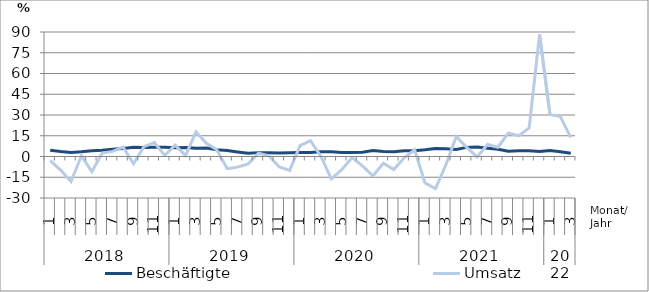
| Category | Beschäftigte | Umsatz |
|---|---|---|
| 0 | 4.5 | -3 |
| 1 | 3.6 | -9.8 |
| 2 | 2.9 | -18.1 |
| 3 | 3.4 | 0.5 |
| 4 | 4.2 | -11 |
| 5 | 4.5 | 2.5 |
| 6 | 5.3 | 3.7 |
| 7 | 5.8 | 6.8 |
| 8 | 6.6 | -5.2 |
| 9 | 6.5 | 7.1 |
| 10 | 6.6 | 10.1 |
| 11 | 6.6 | 0.8 |
| 12 | 6.4 | 8.2 |
| 13 | 6.5 | 0.6 |
| 14 | 6 | 17.8 |
| 15 | 6.1 | 9.6 |
| 16 | 4.9 | 4.9 |
| 17 | 4.3 | -8.8 |
| 18 | 3.3 | -7.7 |
| 19 | 2.4 | -5.4 |
| 20 | 2.8 | 2.4 |
| 21 | 2.7 | 0.5 |
| 22 | 2.5 | -7.6 |
| 23 | 2.7 | -10 |
| 24 | 2.9 | 7.8 |
| 25 | 2.9 | 11.5 |
| 26 | 3.4 | 0.1 |
| 27 | 3.4 | -16.1 |
| 28 | 2.9 | -9.5 |
| 29 | 2.9 | -0.8 |
| 30 | 3.1 | -6.9 |
| 31 | 4.3 | -14 |
| 32 | 3.6 | -4.9 |
| 33 | 3.4 | -9.4 |
| 34 | 4.1 | -0.9 |
| 35 | 4.1 | 4.9 |
| 36 | 4.8 | -19.1 |
| 37 | 5.8 | -23.3 |
| 38 | 5.6 | -6.1 |
| 39 | 5 | 14.4 |
| 40 | 6.6 | 6.6 |
| 41 | 6.9 | -0.3 |
| 42 | 6 | 8.7 |
| 43 | 5.2 | 6.7 |
| 44 | 3.8 | 16.9 |
| 45 | 4.2 | 15 |
| 46 | 4.2 | 20.6 |
| 47 | 3.7 | 88.3 |
| 48 | 4.3 | 30.4 |
| 49 | 3.5 | 28.9 |
| 50 | 2.4 | 13.6 |